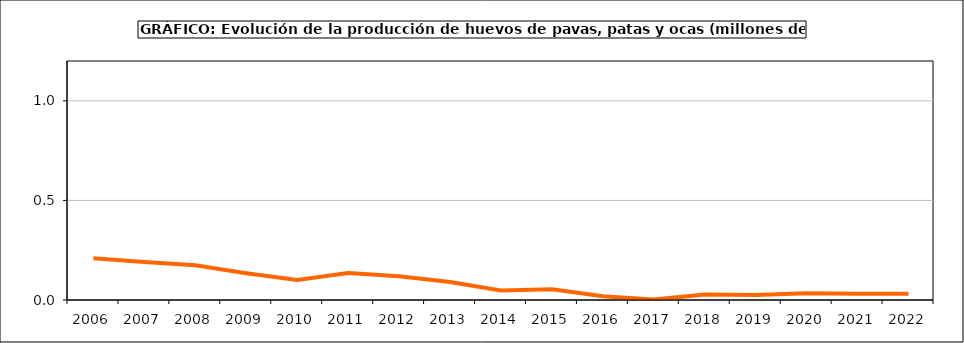
| Category | huevos |
|---|---|
| 2006.0 | 0.209 |
| 2007.0 | 0.191 |
| 2008.0 | 0.174 |
| 2009.0 | 0.135 |
| 2010.0 | 0.1 |
| 2011.0 | 0.135 |
| 2012.0 | 0.119 |
| 2013.0 | 0.09 |
| 2014.0 | 0.047 |
| 2015.0 | 0.054 |
| 2016.0 | 0.019 |
| 2017.0 | 0.002 |
| 2018.0 | 0.027 |
| 2019.0 | 0.026 |
| 2020.0 | 0.034 |
| 2021.0 | 0.032 |
| 2022.0 | 0.032 |